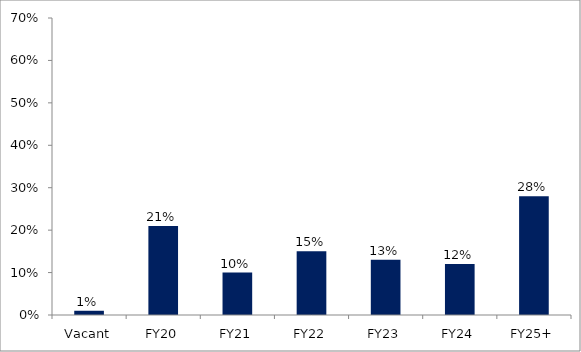
| Category | Series 0 |
|---|---|
| Vacant | 0.01 |
| FY20 | 0.21 |
| FY21 | 0.1 |
| FY22 | 0.15 |
| FY23 | 0.13 |
| FY24 | 0.12 |
| FY25+ | 0.28 |